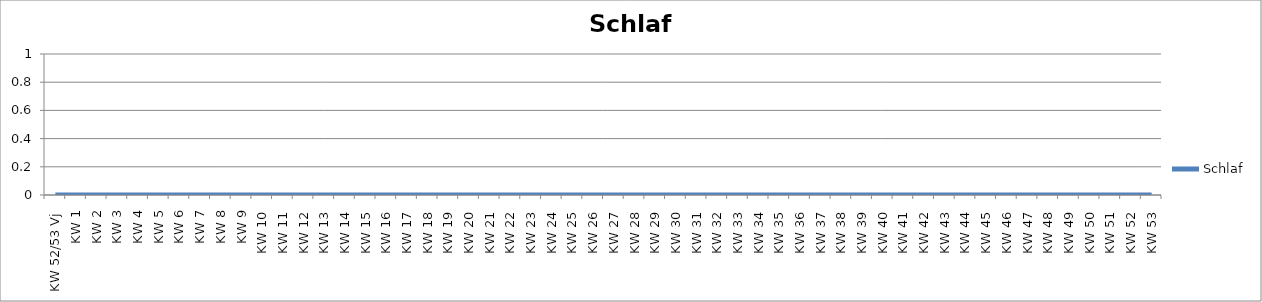
| Category | Schlaf |
|---|---|
| KW 52/53 Vj | 0 |
| KW 1 | 0 |
| KW 2 | 0 |
| KW 3 | 0 |
| KW 4 | 0 |
| KW 5 | 0 |
| KW 6 | 0 |
| KW 7 | 0 |
| KW 8 | 0 |
| KW 9 | 0 |
| KW 10 | 0 |
| KW 11 | 0 |
| KW 12 | 0 |
| KW 13 | 0 |
| KW 14 | 0 |
| KW 15 | 0 |
| KW 16 | 0 |
| KW 17 | 0 |
| KW 18 | 0 |
| KW 19 | 0 |
| KW 20 | 0 |
| KW 21 | 0 |
| KW 22 | 0 |
| KW 23 | 0 |
| KW 24 | 0 |
| KW 25 | 0 |
| KW 26 | 0 |
| KW 27 | 0 |
| KW 28 | 0 |
| KW 29 | 0 |
| KW 30 | 0 |
| KW 31 | 0 |
| KW 32 | 0 |
| KW 33 | 0 |
| KW 34 | 0 |
| KW 35 | 0 |
| KW 36 | 0 |
| KW 37 | 0 |
| KW 38 | 0 |
| KW 39 | 0 |
| KW 40 | 0 |
| KW 41 | 0 |
| KW 42 | 0 |
| KW 43 | 0 |
| KW 44 | 0 |
| KW 45 | 0 |
| KW 46 | 0 |
| KW 47 | 0 |
| KW 48 | 0 |
| KW 49 | 0 |
| KW 50 | 0 |
| KW 51 | 0 |
| KW 52 | 0 |
| KW 53 | 0 |